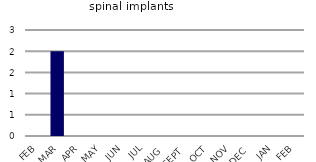
| Category | spinal implants |
|---|---|
| FEB | 0 |
| MAR | 2 |
| APR | 0 |
| MAY | 0 |
| JUN | 0 |
| JUL | 0 |
| AUG | 0 |
| SEPT | 0 |
| OCT | 0 |
| NOV | 0 |
| DEC | 0 |
| JAN | 0 |
| FEB | 0 |